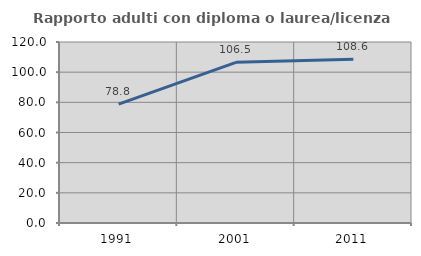
| Category | Rapporto adulti con diploma o laurea/licenza media  |
|---|---|
| 1991.0 | 78.758 |
| 2001.0 | 106.545 |
| 2011.0 | 108.613 |